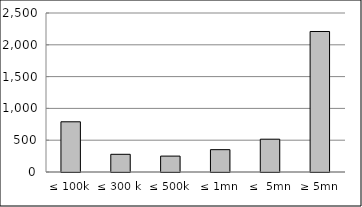
| Category | Series 0 |
|---|---|
| ≤ 100k | 789392401.729 |
| ≤ 300 k | 278249892.446 |
| ≤ 500k | 250092824.5 |
| ≤ 1mn | 351110845.51 |
| ≤  5mn | 515819934.658 |
| ≥ 5mn | 2209309114.513 |